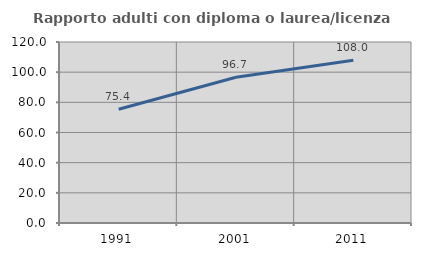
| Category | Rapporto adulti con diploma o laurea/licenza media  |
|---|---|
| 1991.0 | 75.382 |
| 2001.0 | 96.673 |
| 2011.0 | 107.954 |